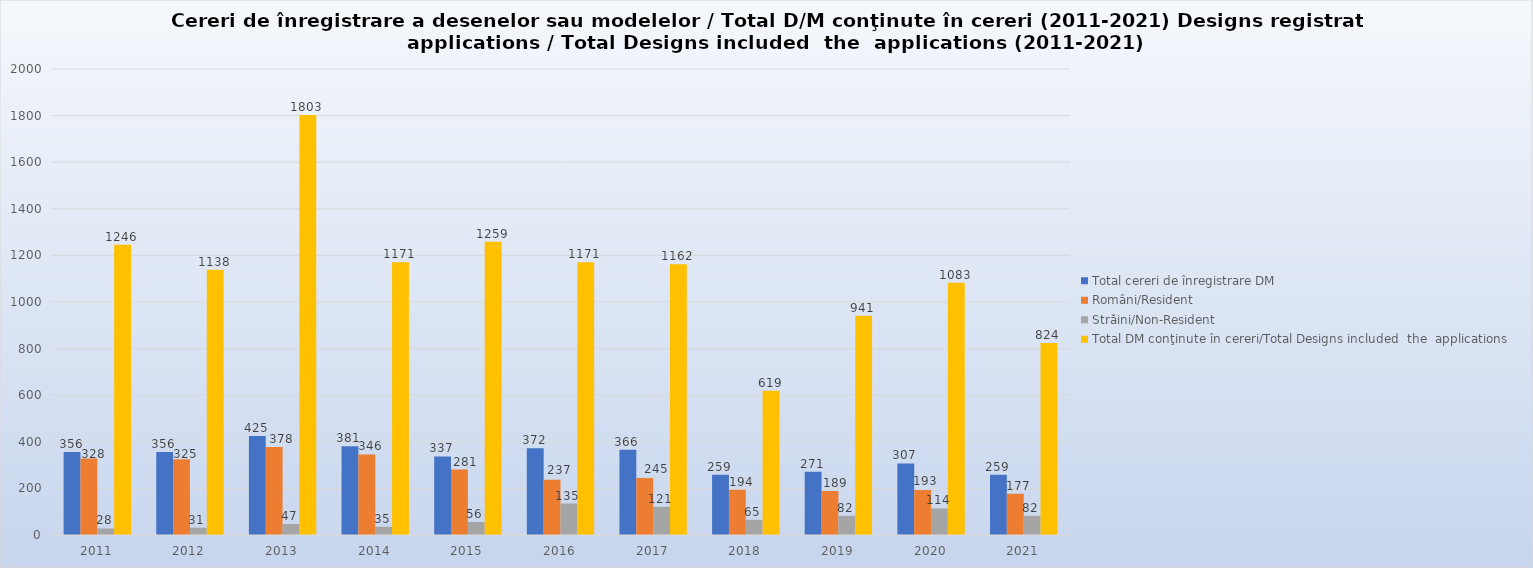
| Category | Total cereri de înregistrare DM | Români/Resident | Străini/Non-Resident | Total DM conţinute în cereri/Total Designs included  the  applications   |
|---|---|---|---|---|
| 2011.0 | 356 | 328 | 28 | 1246 |
| 2012.0 | 356 | 325 | 31 | 1138 |
| 2013.0 | 425 | 378 | 47 | 1803 |
| 2014.0 | 381 | 346 | 35 | 1171 |
| 2015.0 | 337 | 281 | 56 | 1259 |
| 2016.0 | 372 | 237 | 135 | 1171 |
| 2017.0 | 366 | 245 | 121 | 1162 |
| 2018.0 | 259 | 194 | 65 | 619 |
| 2019.0 | 271 | 189 | 82 | 941 |
| 2020.0 | 307 | 193 | 114 | 1083 |
| 2021.0 | 259 | 177 | 82 | 824 |